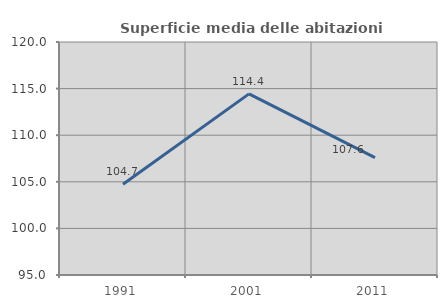
| Category | Superficie media delle abitazioni occupate |
|---|---|
| 1991.0 | 104.728 |
| 2001.0 | 114.436 |
| 2011.0 | 107.599 |